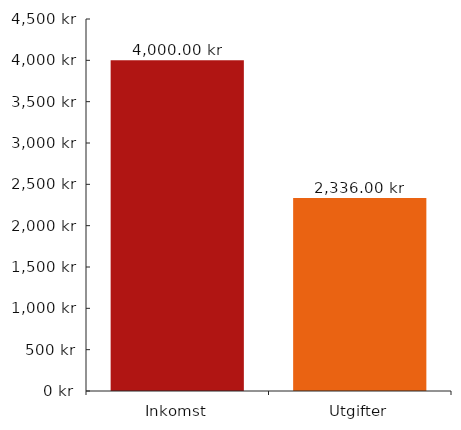
| Category | DiagramData |
|---|---|
| 0 | 4000 |
| 1 | 2336 |